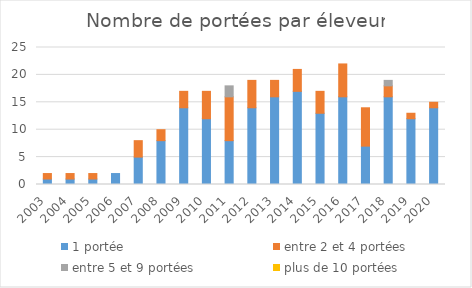
| Category | 1 portée | entre 2 et 4 portées | entre 5 et 9 portées | plus de 10 portées |
|---|---|---|---|---|
| 2003.0 | 1 | 1 | 0 | 0 |
| 2004.0 | 1 | 1 | 0 | 0 |
| 2005.0 | 1 | 1 | 0 | 0 |
| 2006.0 | 2 | 0 | 0 | 0 |
| 2007.0 | 5 | 3 | 0 | 0 |
| 2008.0 | 8 | 2 | 0 | 0 |
| 2009.0 | 14 | 3 | 0 | 0 |
| 2010.0 | 12 | 5 | 0 | 0 |
| 2011.0 | 8 | 8 | 2 | 0 |
| 2012.0 | 14 | 5 | 0 | 0 |
| 2013.0 | 16 | 3 | 0 | 0 |
| 2014.0 | 17 | 4 | 0 | 0 |
| 2015.0 | 13 | 4 | 0 | 0 |
| 2016.0 | 16 | 6 | 0 | 0 |
| 2017.0 | 7 | 7 | 0 | 0 |
| 2018.0 | 16 | 2 | 1 | 0 |
| 2019.0 | 12 | 1 | 0 | 0 |
| 2020.0 | 14 | 1 | 0 | 0 |